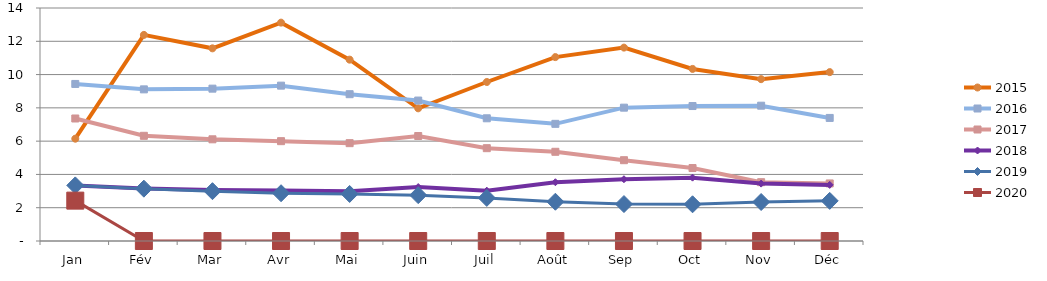
| Category | 2015 | 2016 | 2017 | 2018 | 2019 | 2020 |
|---|---|---|---|---|---|---|
| Jan | 6.147 | 9.436 | 7.361 | 3.34 | 3.341 | 2.425 |
| Fév | 12.385 | 9.111 | 6.321 | 3.159 | 3.145 | 0 |
| Mar | 11.577 | 9.154 | 6.111 | 3.062 | 2.994 | 0 |
| Avr | 13.121 | 9.335 | 5.999 | 3.031 | 2.87 | 0 |
| Mai | 10.896 | 8.821 | 5.878 | 2.984 | 2.827 | 0 |
| Juin | 7.972 | 8.439 | 6.309 | 3.242 | 2.755 | 0 |
| Juil | 9.554 | 7.373 | 5.577 | 3.025 | 2.589 | 0 |
| Août | 11.05 | 7.04 | 5.36 | 3.53 | 2.359 | 0 |
| Sep | 11.62 | 8.012 | 4.855 | 3.712 | 2.22 | 0 |
| Oct | 10.339 | 8.109 | 4.384 | 3.806 | 2.206 | 0 |
| Nov | 9.724 | 8.13 | 3.533 | 3.449 | 2.343 | 0 |
| Déc | 10.148 | 7.395 | 3.458 | 3.371 | 2.411 | 0 |